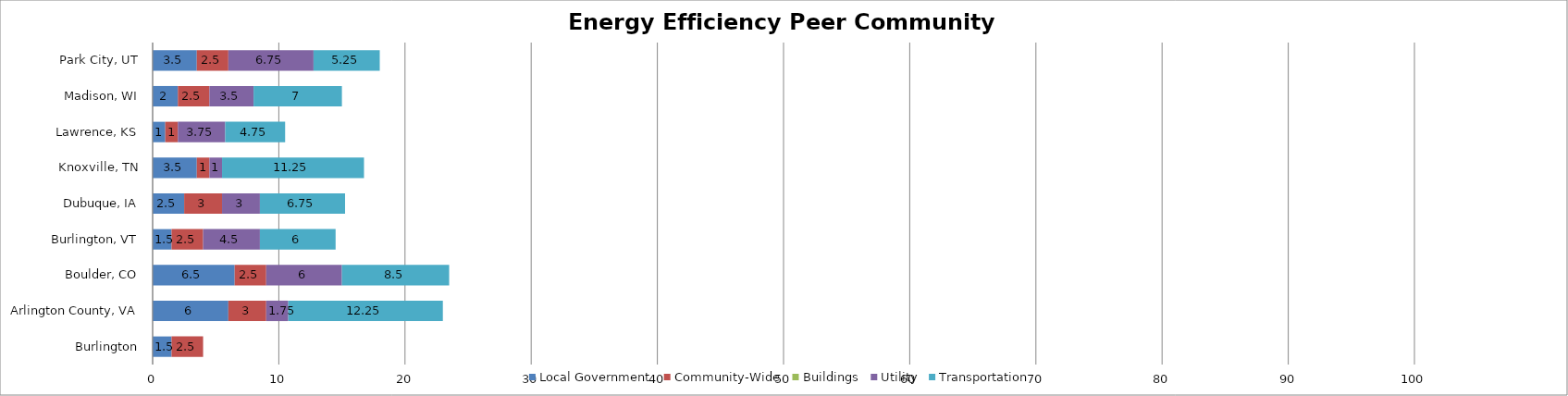
| Category | Local Government | Community-Wide | Buildings | Utility | Transportation |
|---|---|---|---|---|---|
| Burlington | 1.5 | 2.5 |  | 0 | 0 |
| Arlington County, VA | 6 | 3 |  | 1.75 | 12.25 |
| Boulder, CO | 6.5 | 2.5 |  | 6 | 8.5 |
| Burlington, VT | 1.5 | 2.5 |  | 4.5 | 6 |
| Dubuque, IA | 2.5 | 3 |  | 3 | 6.75 |
| Knoxville, TN | 3.5 | 1 |  | 1 | 11.25 |
| Lawrence, KS | 1 | 1 |  | 3.75 | 4.75 |
| Madison, WI | 2 | 2.5 |  | 3.5 | 7 |
| Park City, UT | 3.5 | 2.5 |  | 6.75 | 5.25 |